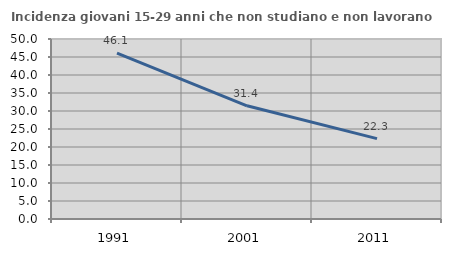
| Category | Incidenza giovani 15-29 anni che non studiano e non lavorano  |
|---|---|
| 1991.0 | 46.052 |
| 2001.0 | 31.445 |
| 2011.0 | 22.328 |